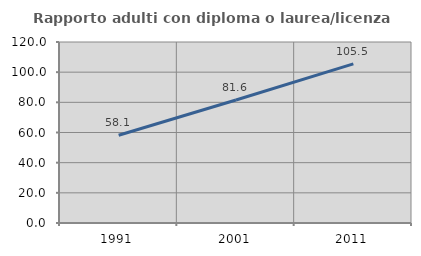
| Category | Rapporto adulti con diploma o laurea/licenza media  |
|---|---|
| 1991.0 | 58.143 |
| 2001.0 | 81.564 |
| 2011.0 | 105.531 |